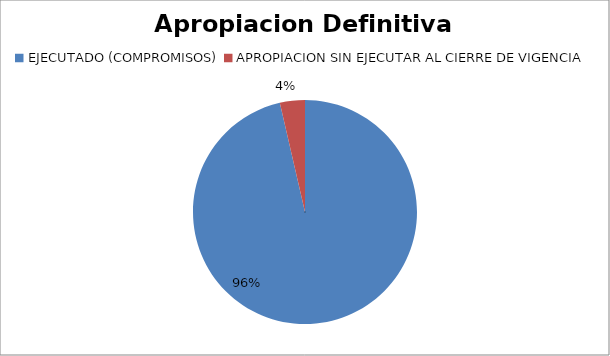
| Category | Apropiacion Definitiva 2014 |
|---|---|
| EJECUTADO (COMPROMISOS) | 461531960500.81 |
| APROPIACION SIN EJECUTAR AL CIERRE DE VIGENCIA | 17292450121.59 |